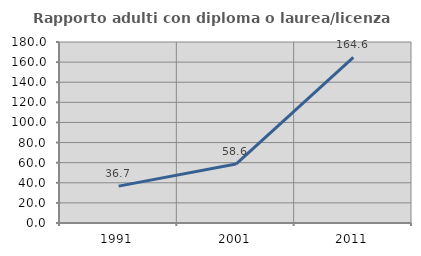
| Category | Rapporto adulti con diploma o laurea/licenza media  |
|---|---|
| 1991.0 | 36.695 |
| 2001.0 | 58.582 |
| 2011.0 | 164.637 |